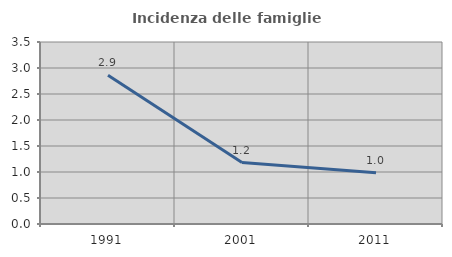
| Category | Incidenza delle famiglie numerose |
|---|---|
| 1991.0 | 2.862 |
| 2001.0 | 1.182 |
| 2011.0 | 0.987 |